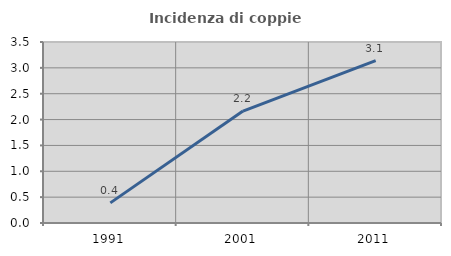
| Category | Incidenza di coppie miste |
|---|---|
| 1991.0 | 0.389 |
| 2001.0 | 2.165 |
| 2011.0 | 3.14 |